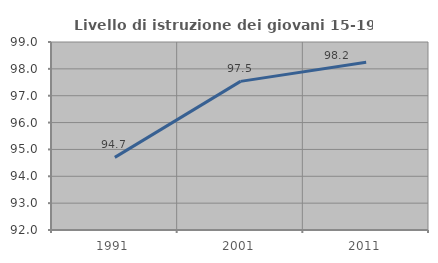
| Category | Livello di istruzione dei giovani 15-19 anni |
|---|---|
| 1991.0 | 94.703 |
| 2001.0 | 97.534 |
| 2011.0 | 98.246 |